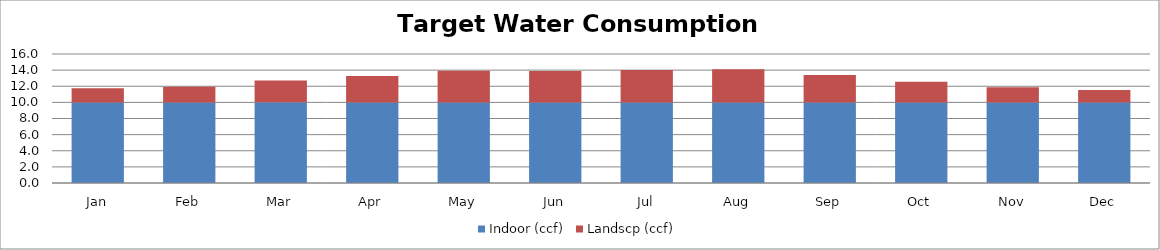
| Category | Indoor (ccf) | Landscp (ccf) |
|---|---|---|
| Jan | 10 | 1.74 |
| Feb | 10 | 1.934 |
| Mar | 10 | 2.726 |
| Apr | 10 | 3.281 |
| May | 10 | 3.927 |
| Jun | 10 | 3.882 |
| Jul | 10 | 4.02 |
| Aug | 10 | 4.1 |
| Sep | 10 | 3.381 |
| Oct | 10 | 2.548 |
| Nov | 10 | 1.888 |
| Dec | 10 | 1.528 |